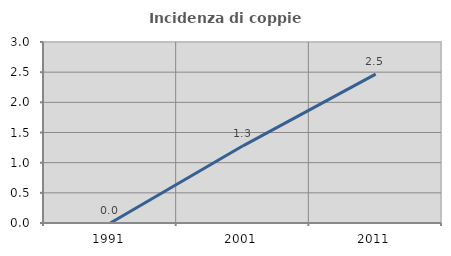
| Category | Incidenza di coppie miste |
|---|---|
| 1991.0 | 0 |
| 2001.0 | 1.279 |
| 2011.0 | 2.467 |